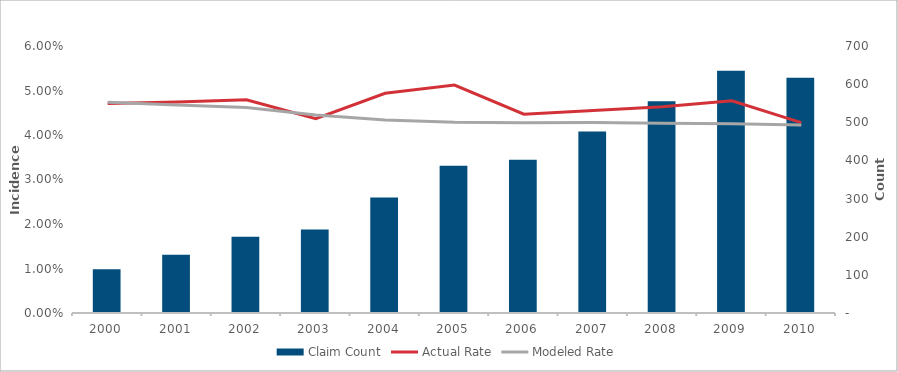
| Category | Claim Count |
|---|---|
| 2000.0 | 115 |
| 2001.0 | 153 |
| 2002.0 | 200 |
| 2003.0 | 219 |
| 2004.0 | 303 |
| 2005.0 | 386 |
| 2006.0 | 402 |
| 2007.0 | 476 |
| 2008.0 | 555 |
| 2009.0 | 635 |
| 2010.0 | 617 |